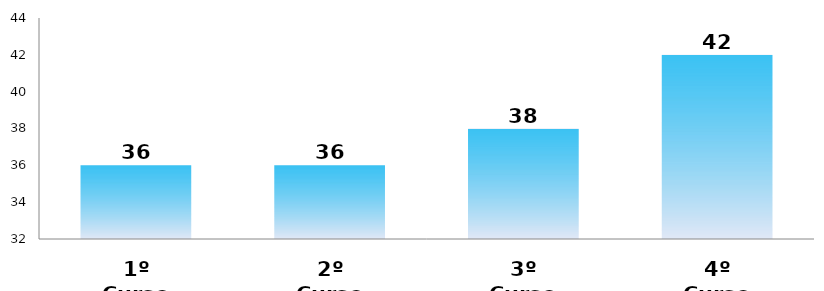
| Category | Series 0 |
|---|---|
| 1º Curso | 36 |
| 2º Curso | 36 |
| 3º Curso | 38 |
| 4º Curso | 42 |